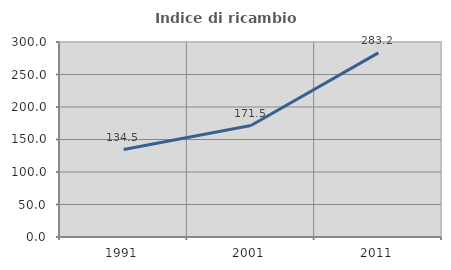
| Category | Indice di ricambio occupazionale  |
|---|---|
| 1991.0 | 134.52 |
| 2001.0 | 171.538 |
| 2011.0 | 283.218 |